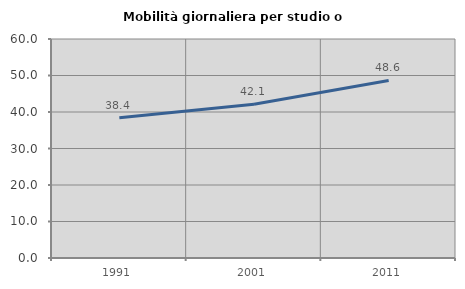
| Category | Mobilità giornaliera per studio o lavoro |
|---|---|
| 1991.0 | 38.403 |
| 2001.0 | 42.115 |
| 2011.0 | 48.631 |